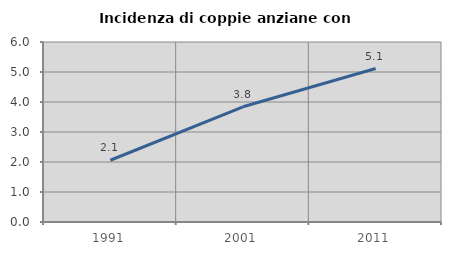
| Category | Incidenza di coppie anziane con figli |
|---|---|
| 1991.0 | 2.059 |
| 2001.0 | 3.841 |
| 2011.0 | 5.115 |